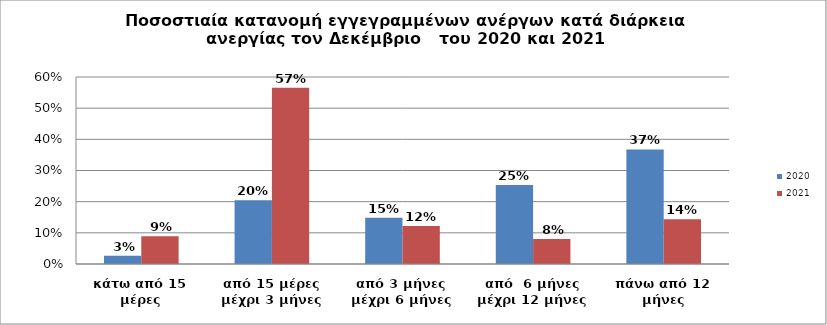
| Category | 2020 | 2021 |
|---|---|---|
| κάτω από 15 μέρες | 0.026 | 0.089 |
| από 15 μέρες μέχρι 3 μήνες | 0.205 | 0.566 |
| από 3 μήνες μέχρι 6 μήνες | 0.148 | 0.122 |
| από  6 μήνες μέχρι 12 μήνες | 0.253 | 0.08 |
| πάνω από 12 μήνες | 0.368 | 0.143 |